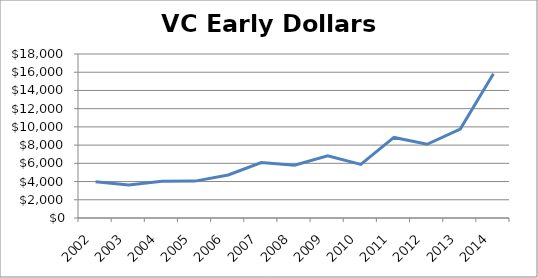
| Category | Early Dollars |
|---|---|
| 2002.0 | 3972 |
| 2003.0 | 3617 |
| 2004.0 | 4046 |
| 2005.0 | 4048 |
| 2006.0 | 4719 |
| 2007.0 | 6082 |
| 2008.0 | 5786 |
| 2009.0 | 6829 |
| 2010.0 | 5880 |
| 2011.0 | 8842 |
| 2012.0 | 8089 |
| 2013.0 | 9759 |
| 2014.0 | 15825 |